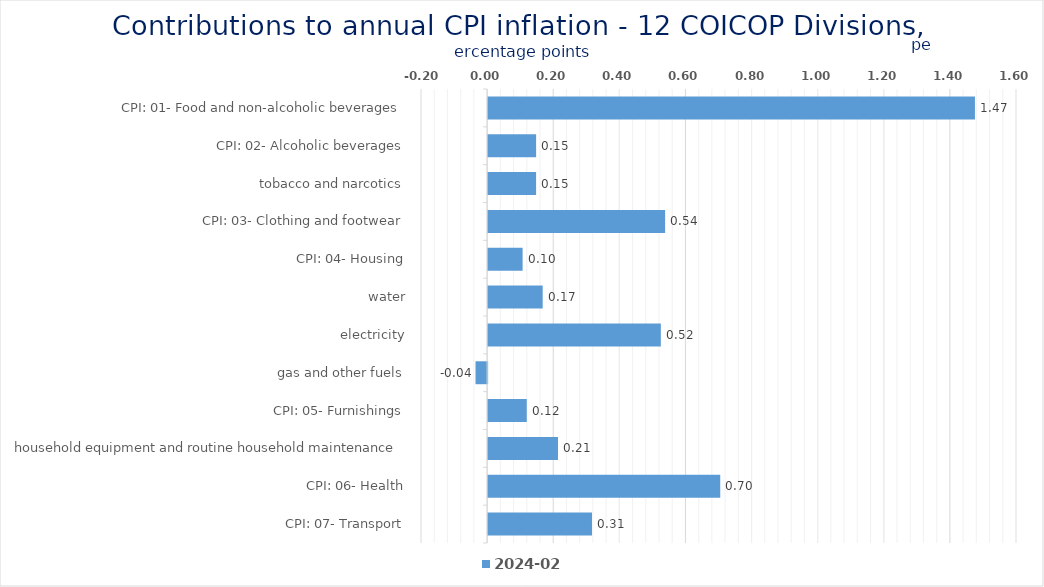
| Category | 2024-02 |
|---|---|
| CPI: 01- Food and non-alcoholic beverages | 1.473 |
| CPI: 02- Alcoholic beverages, tobacco and narcotics | 0.145 |
| CPI: 03- Clothing and footwear | 0.145 |
| CPI: 04- Housing, water, electricity, gas and other fuels | 0.535 |
| CPI: 05- Furnishings, household equipment and routine household maintenance | 0.104 |
| CPI: 06- Health | 0.165 |
| CPI: 07- Transport | 0.523 |
| CPI: 08- Communication | -0.035 |
| CPI: 09- Recreation and culture | 0.117 |
| CPI: 10- Education | 0.211 |
| CPI: 11- Restaurants and hotels | 0.702 |
| CPI: 12- Miscellaneous goods and services | 0.314 |